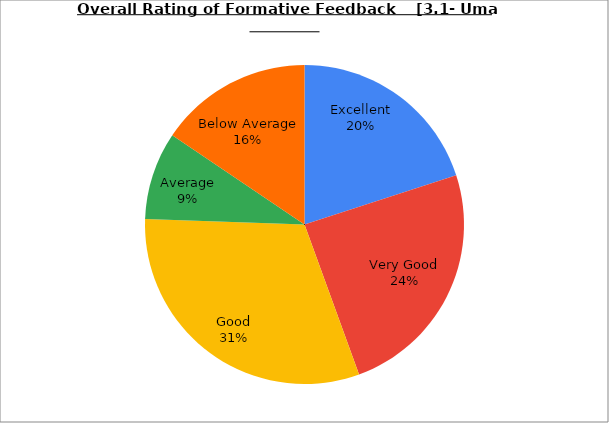
| Category | Series 0 |
|---|---|
| Excellent | 20 |
| Very Good | 24.444 |
| Good | 31.111 |
| Average | 8.889 |
| Below Average | 15.556 |